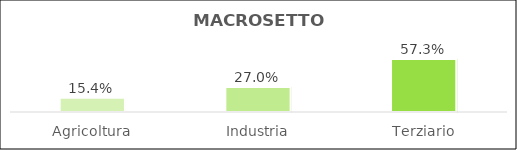
| Category | Series 0 |
|---|---|
| Agricoltura | 0.154 |
| Industria | 0.27 |
| Terziario | 0.573 |